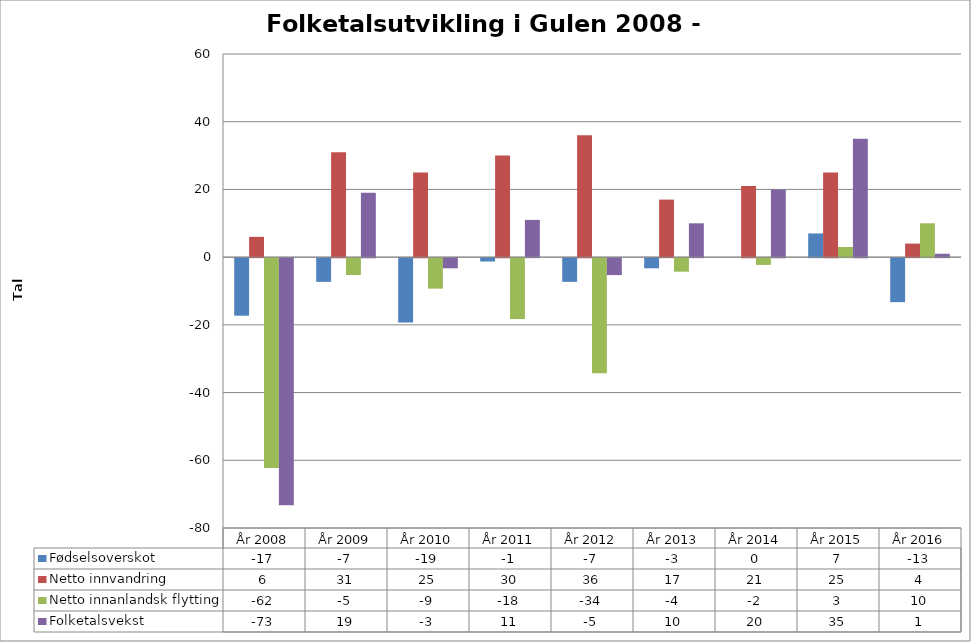
| Category | Fødselsoverskot | Netto innvandring | Netto innanlandsk flytting | Folketalsvekst |
|---|---|---|---|---|
| År 2008 | -17 | 6 | -62 | -73 |
| År 2009 | -7 | 31 | -5 | 19 |
| År 2010 | -19 | 25 | -9 | -3 |
| År 2011 | -1 | 30 | -18 | 11 |
| År 2012 | -7 | 36 | -34 | -5 |
| År 2013 | -3 | 17 | -4 | 10 |
| År 2014 | 0 | 21 | -2 | 20 |
| År 2015 | 7 | 25 | 3 | 35 |
| År 2016 | -13 | 4 | 10 | 1 |